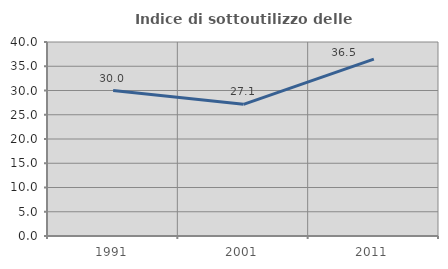
| Category | Indice di sottoutilizzo delle abitazioni  |
|---|---|
| 1991.0 | 29.988 |
| 2001.0 | 27.143 |
| 2011.0 | 36.481 |